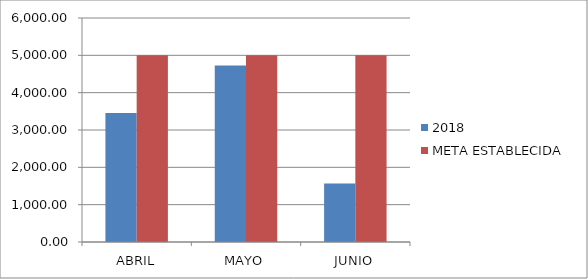
| Category | 2018 | META ESTABLECIDA  |
|---|---|---|
| ABRIL | 3454.16 | 5000 |
| MAYO | 4727.9 | 5000 |
| JUNIO | 1566.4 | 5000 |